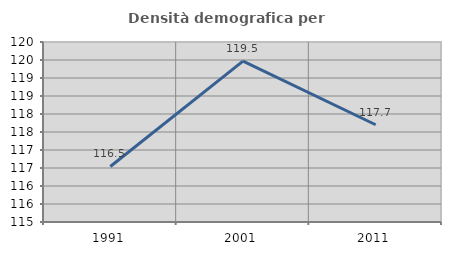
| Category | Densità demografica |
|---|---|
| 1991.0 | 116.542 |
| 2001.0 | 119.469 |
| 2011.0 | 117.701 |